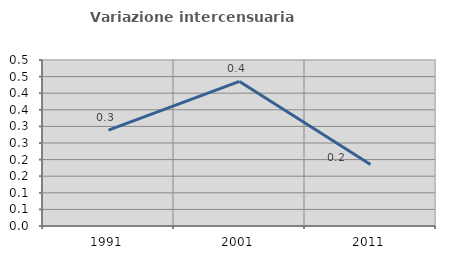
| Category | Variazione intercensuaria annua |
|---|---|
| 1991.0 | 0.289 |
| 2001.0 | 0.435 |
| 2011.0 | 0.186 |